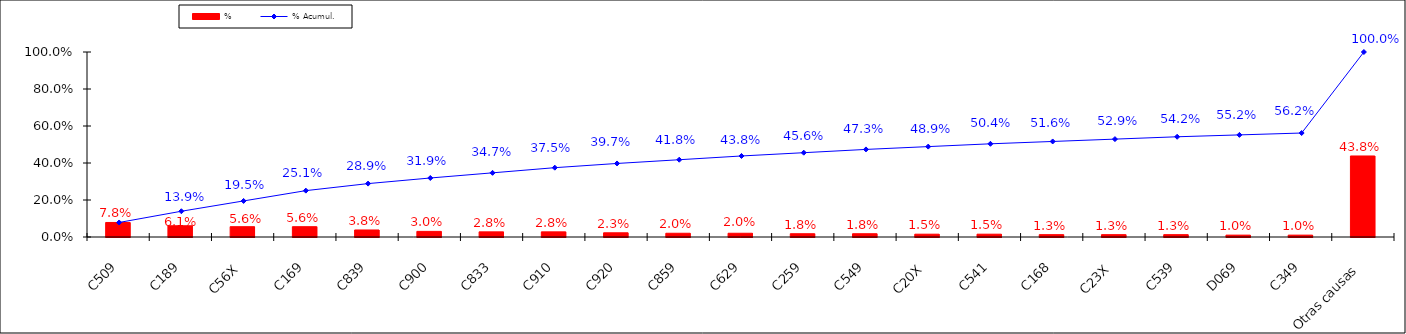
| Category | % |
|---|---|
| C509 | 0.078 |
| C189 | 0.061 |
| C56X | 0.056 |
| C169 | 0.056 |
| C839 | 0.038 |
| C900 | 0.03 |
| C833 | 0.028 |
| C910 | 0.028 |
| C920 | 0.023 |
| C859 | 0.02 |
| C629 | 0.02 |
| C259 | 0.018 |
| C549 | 0.018 |
| C20X | 0.015 |
| C541 | 0.015 |
| C168 | 0.013 |
| C23X | 0.013 |
| C539 | 0.013 |
| D069 | 0.01 |
| C349 | 0.01 |
| Otras causas | 0.438 |